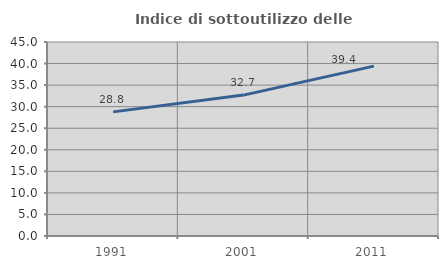
| Category | Indice di sottoutilizzo delle abitazioni  |
|---|---|
| 1991.0 | 28.789 |
| 2001.0 | 32.684 |
| 2011.0 | 39.404 |